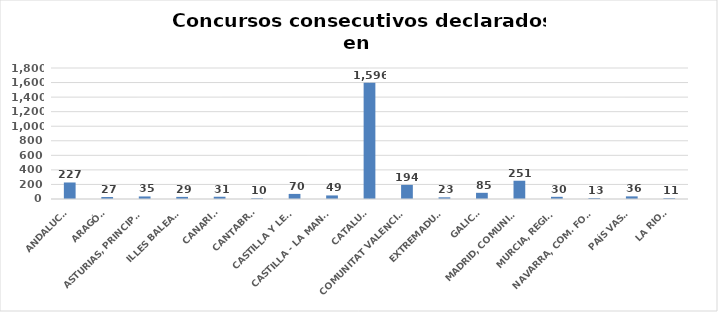
| Category | Series 0 |
|---|---|
| ANDALUCÍA | 227 |
| ARAGÓN | 27 |
| ASTURIAS, PRINCIPADO | 35 |
| ILLES BALEARS | 29 |
| CANARIAS | 31 |
| CANTABRIA | 10 |
| CASTILLA Y LEÓN | 70 |
| CASTILLA - LA MANCHA | 49 |
| CATALUÑA | 1596 |
| COMUNITAT VALENCIANA | 194 |
| EXTREMADURA | 23 |
| GALICIA | 85 |
| MADRID, COMUNIDAD | 251 |
| MURCIA, REGIÓN | 30 |
| NAVARRA, COM. FORAL | 13 |
| PAÍS VASCO | 36 |
| LA RIOJA | 11 |